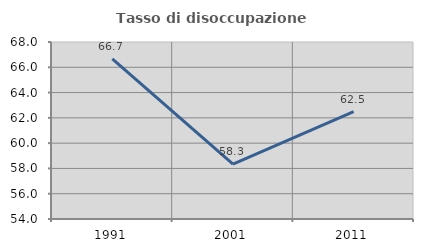
| Category | Tasso di disoccupazione giovanile  |
|---|---|
| 1991.0 | 66.667 |
| 2001.0 | 58.333 |
| 2011.0 | 62.5 |